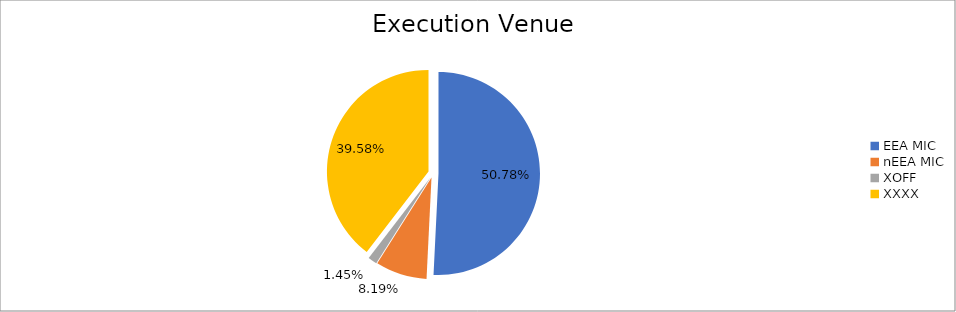
| Category | Series 0 |
|---|---|
| EEA MIC | 6463003.807 |
| nEEA MIC | 1042342.553 |
| XOFF | 184386.077 |
| XXXX | 5037444.418 |